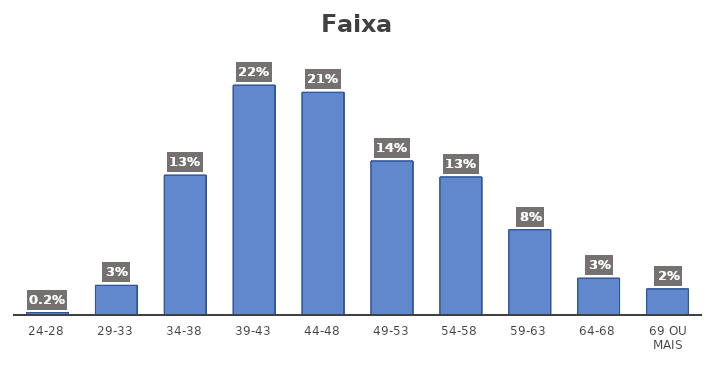
| Category | Series 0 |
|---|---|
| 24-28 | 0.002 |
| 29-33 | 0.028 |
| 34-38 | 0.131 |
| 39-43 | 0.216 |
| 44-48 | 0.209 |
| 49-53 | 0.145 |
| 54-58 | 0.13 |
| 59-63 | 0.08 |
| 64-68 | 0.035 |
| 69 ou mais | 0.024 |